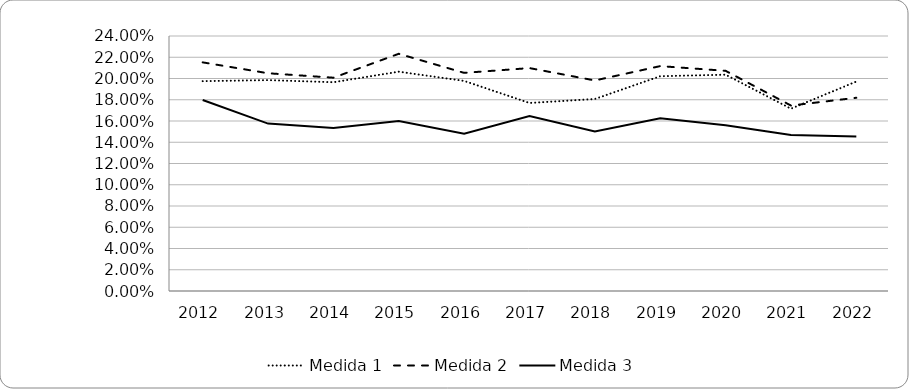
| Category | Medida 1 | Medida 2 | Medida 3 |
|---|---|---|---|
| 2012.0 | 0.197 | 0.215 | 0.18 |
| 2013.0 | 0.198 | 0.205 | 0.158 |
| 2014.0 | 0.196 | 0.201 | 0.153 |
| 2015.0 | 0.206 | 0.223 | 0.16 |
| 2016.0 | 0.198 | 0.205 | 0.148 |
| 2017.0 | 0.177 | 0.21 | 0.165 |
| 2018.0 | 0.181 | 0.198 | 0.15 |
| 2019.0 | 0.202 | 0.212 | 0.163 |
| 2020.0 | 0.204 | 0.207 | 0.156 |
| 2021.0 | 0.172 | 0.175 | 0.147 |
| 2022.0 | 0.197 | 0.182 | 0.145 |